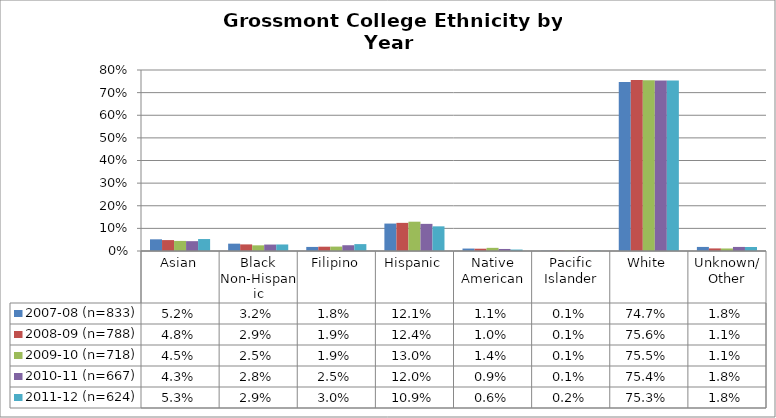
| Category | 2007-08 (n=833) | 2008-09 (n=788) | 2009-10 (n=718) | 2010-11 (n=667) | 2011-12 (n=624) |
|---|---|---|---|---|---|
| Asian | 0.052 | 0.048 | 0.045 | 0.043 | 0.053 |
| Black Non-Hispanic | 0.032 | 0.029 | 0.025 | 0.028 | 0.029 |
| Filipino | 0.018 | 0.019 | 0.019 | 0.025 | 0.03 |
| Hispanic | 0.121 | 0.124 | 0.13 | 0.12 | 0.109 |
| Native American | 0.011 | 0.01 | 0.014 | 0.009 | 0.006 |
| Pacific Islander | 0.001 | 0.001 | 0.001 | 0.001 | 0.002 |
| White | 0.747 | 0.756 | 0.755 | 0.754 | 0.753 |
| Unknown/ Other | 0.018 | 0.011 | 0.011 | 0.018 | 0.018 |